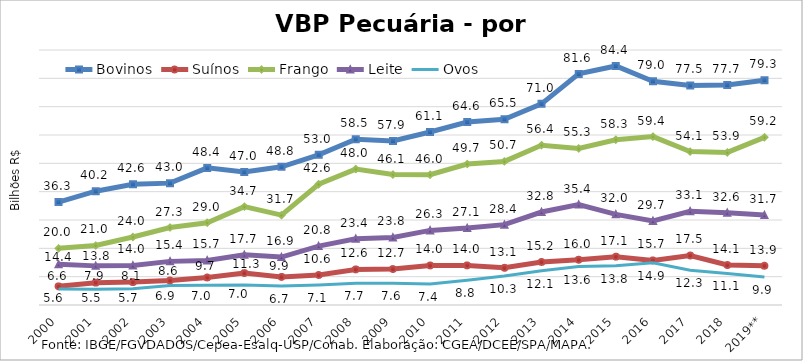
| Category | Bovinos | Suínos | Frango | Leite | Ovos |
|---|---|---|---|---|---|
| 2000 | 36.331 | 6.578 | 19.991 | 14.35 | 5.611 |
| 2001 | 40.16 | 7.892 | 21.012 | 13.809 | 5.529 |
| 2002 | 42.618 | 8.089 | 23.985 | 13.983 | 5.696 |
| 2003 | 43.013 | 8.645 | 27.345 | 15.398 | 6.891 |
| 2004 | 48.394 | 9.719 | 29.037 | 15.738 | 6.984 |
| 2005 | 46.984 | 11.269 | 34.715 | 17.7 | 7.031 |
| 2006 | 48.781 | 9.913 | 31.714 | 16.907 | 6.679 |
| 2007 | 53.013 | 10.6 | 42.611 | 20.784 | 7.098 |
| 2008 | 58.533 | 12.551 | 47.966 | 23.381 | 7.666 |
| 2009 | 57.923 | 12.687 | 46.054 | 23.838 | 7.644 |
| 2010 | 61.068 | 13.957 | 45.998 | 26.325 | 7.434 |
| 2011 | 64.558 | 13.979 | 49.749 | 27.138 | 8.76 |
| 2012 | 65.52 | 13.126 | 50.678 | 28.358 | 10.269 |
| 2013 | 71.001 | 15.197 | 56.405 | 32.816 | 12.078 |
| 2014 | 81.567 | 15.962 | 55.264 | 35.437 | 13.57 |
| 2015 | 84.374 | 17.059 | 58.342 | 31.988 | 13.817 |
| 2016 | 78.978 | 15.743 | 59.446 | 29.681 | 14.895 |
| 2017 | 77.504 | 17.476 | 54.145 | 33.071 | 12.278 |
| 2018 | 77.683 | 14.105 | 53.85 | 32.569 | 11.134 |
| 2019** | 79.319 | 13.866 | 59.185 | 31.737 | 9.868 |